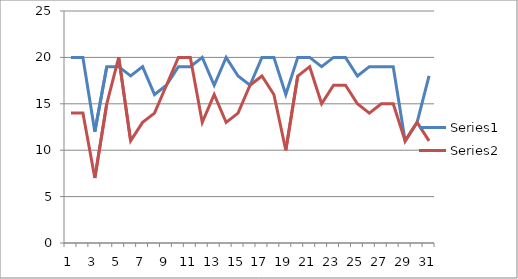
| Category | Series 0 | Series 1 |
|---|---|---|
| 0 | 20 | 14 |
| 1 | 20 | 14 |
| 2 | 12 | 7 |
| 3 | 19 | 15 |
| 4 | 19 | 20 |
| 5 | 18 | 11 |
| 6 | 19 | 13 |
| 7 | 16 | 14 |
| 8 | 17 | 17 |
| 9 | 19 | 20 |
| 10 | 19 | 20 |
| 11 | 20 | 13 |
| 12 | 17 | 16 |
| 13 | 20 | 13 |
| 14 | 18 | 14 |
| 15 | 17 | 17 |
| 16 | 20 | 18 |
| 17 | 20 | 16 |
| 18 | 16 | 10 |
| 19 | 20 | 18 |
| 20 | 20 | 19 |
| 21 | 19 | 15 |
| 22 | 20 | 17 |
| 23 | 20 | 17 |
| 24 | 18 | 15 |
| 25 | 19 | 14 |
| 26 | 19 | 15 |
| 27 | 19 | 15 |
| 28 | 11 | 11 |
| 29 | 13 | 13 |
| 30 | 18 | 11 |